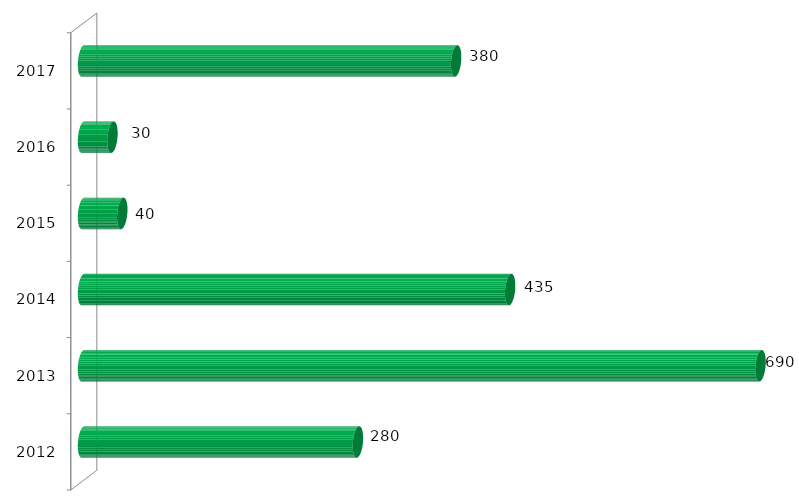
| Category | Vagas ofertadas |
|---|---|
| 2012.0 | 280 |
| 2013.0 | 690 |
| 2014.0 | 435 |
| 2015.0 | 40 |
| 2016.0 | 30 |
| 2017.0 | 380 |